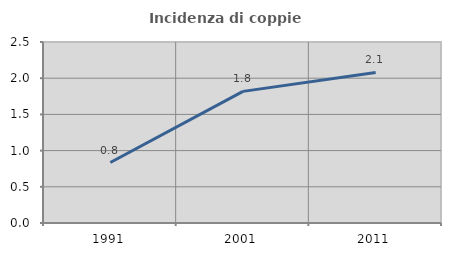
| Category | Incidenza di coppie miste |
|---|---|
| 1991.0 | 0.835 |
| 2001.0 | 1.818 |
| 2011.0 | 2.079 |